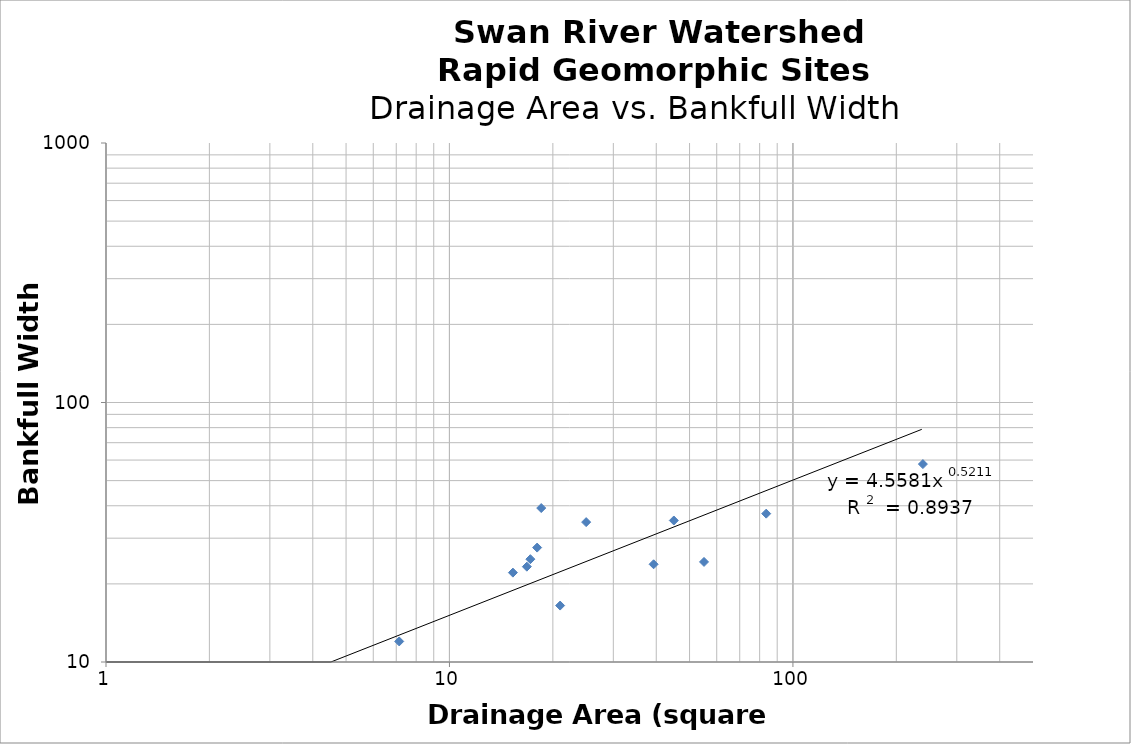
| Category | Bkf_W |
|---|---|
| 7.14 | 12 |
| 15.3 | 22.1 |
| 16.8 | 23.3 |
| 17.2 | 24.9 |
| 18.0 | 27.6 |
| 0.1 | 1 |
| 18.5 | 39.2 |
| 21.0 | 16.5 |
| 25.0 | 34.6 |
| 39.3 | 23.8 |
| 45.0 | 35.1 |
| 55.1 | 24.3 |
| 83.6 | 37.3 |
| 239.0 | 57.9 |